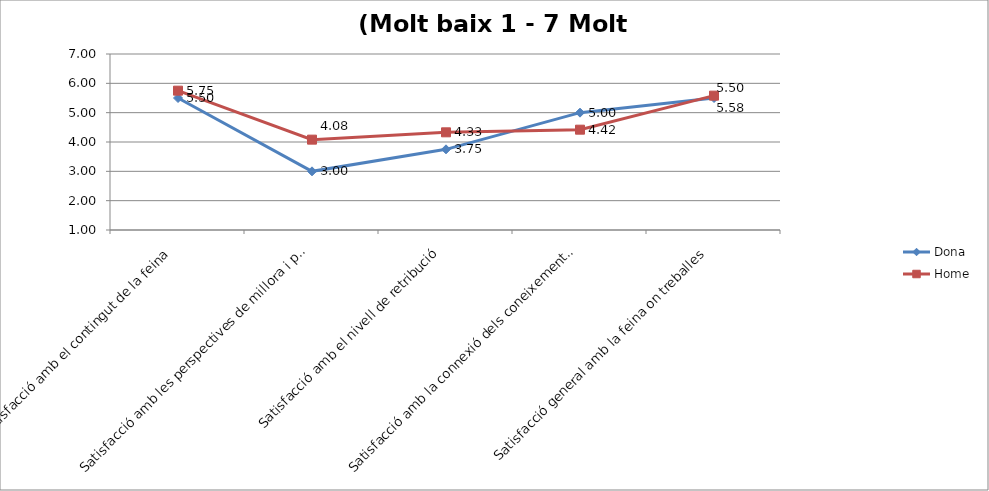
| Category | Dona | Home |
|---|---|---|
| Satisfacció amb el contingut de la feina | 5.5 | 5.75 |
| Satisfacció amb les perspectives de millora i promoció | 3 | 4.08 |
| Satisfacció amb el nivell de retribució | 3.75 | 4.33 |
| Satisfacció amb la connexió dels coneixements/competències desenvolupades de la formació doctoral i la feina | 5 | 4.42 |
| Satisfacció general amb la feina on treballes | 5.5 | 5.58 |